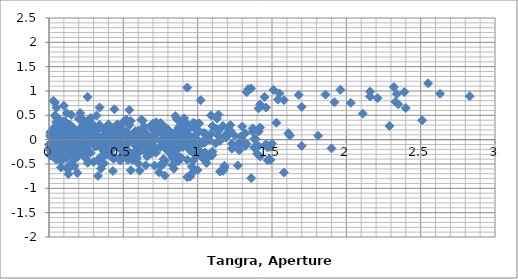
| Category | Series 0 |
|---|---|
| 0.1999999999999993 | -0.051 |
| 0.27999999999999936 | -0.267 |
| 0.3199999999999985 | 0.495 |
| 0.4299999999999997 | 0.243 |
| 0.4399999999999995 | -0.087 |
| 0.47999999999999865 | 0.167 |
| 0.48999999999999844 | -0.048 |
| 0.5 | 0.112 |
| 0.5099999999999998 | -0.189 |
| 0.5399999999999991 | 0.611 |
| 0.6199999999999992 | 0.04 |
| 0.6699999999999999 | 0.006 |
| 0.6699999999999999 | -0.096 |
| 0.7199999999999989 | 0.358 |
| 0.7999999999999989 | 0.136 |
| 0.8699999999999992 | -0.134 |
| 0.9099999999999984 | 0.124 |
| 0.9699999999999989 | -0.033 |
| 1.129999999999999 | 0.218 |
| 1.1499999999999986 | -0.027 |
| 1.25 | 0.08 |
| 1.2799999999999994 | -0.059 |
| 1.2899999999999991 | 0.068 |
| 1.3199999999999985 | -0.129 |
| 1.3699999999999992 | 0.233 |
| 1.379999999999999 | 0.014 |
| 1.4099999999999984 | 0.166 |
| 1.42 | 0.249 |
| 1.4699999999999989 | -0.159 |
| 1.4899999999999984 | -0.147 |
| 1.5 | -0.084 |
| 1.8099999999999987 | 0.082 |
| 1.8999999999999986 | -0.179 |
| 2.83 | 0.892 |
| 0.08000000000000007 | -0.216 |
| 0.11999999999999922 | 0.546 |
| 0.23000000000000043 | 0.294 |
| 0.2400000000000002 | -0.036 |
| 0.27999999999999936 | 0.218 |
| 0.28999999999999915 | 0.003 |
| 0.3000000000000007 | 0.163 |
| 0.3100000000000005 | -0.138 |
| 0.33999999999999986 | 0.661 |
| 0.41999999999999993 | 0.091 |
| 0.47000000000000064 | 0.057 |
| 0.47000000000000064 | -0.045 |
| 0.5199999999999996 | 0.408 |
| 0.5999999999999996 | 0.187 |
| 0.6699999999999999 | -0.083 |
| 0.7099999999999991 | 0.175 |
| 0.7699999999999996 | 0.017 |
| 0.9299999999999997 | 0.269 |
| 0.9499999999999993 | 0.024 |
| 1.0500000000000007 | 0.13 |
| 1.08 | -0.008 |
| 1.0899999999999999 | 0.119 |
| 1.1199999999999992 | -0.079 |
| 1.17 | 0.284 |
| 1.1799999999999997 | 0.065 |
| 1.209999999999999 | 0.216 |
| 1.2200000000000006 | 0.3 |
| 1.2699999999999996 | -0.109 |
| 1.2899999999999991 | -0.096 |
| 1.3000000000000007 | -0.033 |
| 1.6099999999999994 | 0.132 |
| 1.6999999999999993 | -0.128 |
| 2.630000000000001 | 0.943 |
| 0.03999999999999915 | 0.762 |
| 0.15000000000000036 | 0.51 |
| 0.16000000000000014 | 0.18 |
| 0.1999999999999993 | 0.434 |
| 0.20999999999999908 | 0.218 |
| 0.22000000000000064 | 0.379 |
| 0.23000000000000043 | 0.078 |
| 0.2599999999999998 | 0.877 |
| 0.33999999999999986 | 0.307 |
| 0.39000000000000057 | 0.273 |
| 0.39000000000000057 | 0.17 |
| 0.4399999999999995 | 0.624 |
| 0.5199999999999996 | 0.403 |
| 0.5899999999999999 | 0.132 |
| 0.629999999999999 | 0.39 |
| 0.6899999999999995 | 0.233 |
| 0.8499999999999996 | 0.485 |
| 0.8699999999999992 | 0.24 |
| 0.9700000000000006 | 0.346 |
| 1.0 | 0.208 |
| 1.0099999999999998 | 0.335 |
| 1.0399999999999991 | 0.137 |
| 1.0899999999999999 | 0.499 |
| 1.0999999999999996 | 0.281 |
| 1.129999999999999 | 0.432 |
| 1.1400000000000006 | 0.516 |
| 1.1899999999999995 | 0.107 |
| 1.209999999999999 | 0.12 |
| 1.2200000000000006 | 0.183 |
| 1.5299999999999994 | 0.348 |
| 1.6199999999999992 | 0.087 |
| 2.5500000000000007 | 1.159 |
| 0.11000000000000121 | -0.252 |
| 0.120000000000001 | -0.582 |
| 0.16000000000000014 | -0.328 |
| 0.16999999999999993 | -0.543 |
| 0.1800000000000015 | -0.383 |
| 0.19000000000000128 | -0.684 |
| 0.22000000000000064 | 0.116 |
| 0.3000000000000007 | -0.455 |
| 0.3500000000000014 | -0.489 |
| 0.3500000000000014 | -0.591 |
| 0.40000000000000036 | -0.137 |
| 0.4800000000000004 | -0.359 |
| 0.5500000000000007 | -0.629 |
| 0.5899999999999999 | -0.371 |
| 0.6500000000000004 | -0.528 |
| 0.8100000000000005 | -0.277 |
| 0.8300000000000001 | -0.522 |
| 0.9300000000000015 | -0.415 |
| 0.9600000000000009 | -0.554 |
| 0.9700000000000006 | -0.427 |
| 1.0 | -0.624 |
| 1.0500000000000007 | -0.262 |
| 1.0600000000000005 | -0.481 |
| 1.0899999999999999 | -0.329 |
| 1.1000000000000014 | -0.246 |
| 1.1500000000000004 | -0.654 |
| 1.17 | -0.642 |
| 1.1800000000000015 | -0.579 |
| 1.4900000000000002 | -0.413 |
| 1.58 | -0.674 |
| 2.5100000000000016 | 0.397 |
| 0.009999999999999787 | -0.33 |
| 0.049999999999998934 | -0.076 |
| 0.05999999999999872 | -0.291 |
| 0.07000000000000028 | -0.131 |
| 0.08000000000000007 | -0.432 |
| 0.10999999999999943 | 0.368 |
| 0.1899999999999995 | -0.203 |
| 0.2400000000000002 | -0.237 |
| 0.2400000000000002 | -0.339 |
| 0.28999999999999915 | 0.115 |
| 0.3699999999999992 | -0.107 |
| 0.4399999999999995 | -0.377 |
| 0.47999999999999865 | -0.119 |
| 0.5399999999999991 | -0.276 |
| 0.6999999999999993 | -0.025 |
| 0.7199999999999989 | -0.27 |
| 0.8200000000000003 | -0.163 |
| 0.8499999999999996 | -0.302 |
| 0.8599999999999994 | -0.175 |
| 0.8899999999999988 | -0.372 |
| 0.9399999999999995 | -0.01 |
| 0.9499999999999993 | -0.229 |
| 0.9799999999999986 | -0.077 |
| 0.9900000000000002 | 0.006 |
| 1.0399999999999991 | -0.402 |
| 1.0599999999999987 | -0.39 |
| 1.0700000000000003 | -0.327 |
| 1.379999999999999 | -0.161 |
| 1.4699999999999989 | -0.422 |
| 2.4000000000000004 | 0.649 |
| 0.03999999999999915 | 0.254 |
| 0.049999999999998934 | 0.039 |
| 0.0600000000000005 | 0.199 |
| 0.07000000000000028 | -0.102 |
| 0.09999999999999964 | 0.697 |
| 0.17999999999999972 | 0.127 |
| 0.23000000000000043 | 0.093 |
| 0.23000000000000043 | -0.009 |
| 0.27999999999999936 | 0.444 |
| 0.35999999999999943 | 0.223 |
| 0.4299999999999997 | -0.047 |
| 0.46999999999999886 | 0.211 |
| 0.5299999999999994 | 0.053 |
| 0.6899999999999995 | 0.305 |
| 0.7099999999999991 | 0.06 |
| 0.8100000000000005 | 0.166 |
| 0.8399999999999999 | 0.028 |
| 0.8499999999999996 | 0.155 |
| 0.879999999999999 | -0.043 |
| 0.9299999999999997 | 0.32 |
| 0.9399999999999995 | 0.101 |
| 0.9699999999999989 | 0.252 |
| 0.9800000000000004 | 0.336 |
| 1.0299999999999994 | -0.073 |
| 1.049999999999999 | -0.06 |
| 1.0600000000000005 | 0.003 |
| 1.3699999999999992 | 0.168 |
| 1.459999999999999 | -0.092 |
| 2.3900000000000006 | 0.979 |
| 0.009999999999999787 | -0.215 |
| 0.02000000000000135 | -0.055 |
| 0.030000000000001137 | -0.356 |
| 0.0600000000000005 | 0.444 |
| 0.14000000000000057 | -0.127 |
| 0.19000000000000128 | -0.161 |
| 0.19000000000000128 | -0.263 |
| 0.2400000000000002 | 0.191 |
| 0.3200000000000003 | -0.031 |
| 0.39000000000000057 | -0.301 |
| 0.4299999999999997 | -0.043 |
| 0.4900000000000002 | -0.2 |
| 0.6500000000000004 | 0.051 |
| 0.6699999999999999 | -0.194 |
| 0.7700000000000014 | -0.087 |
| 0.8000000000000007 | -0.226 |
| 0.8100000000000005 | -0.099 |
| 0.8399999999999999 | -0.296 |
| 0.8900000000000006 | 0.066 |
| 0.9000000000000004 | -0.153 |
| 0.9299999999999997 | -0.001 |
| 0.9400000000000013 | 0.082 |
| 0.9900000000000002 | -0.326 |
| 1.0099999999999998 | -0.314 |
| 1.0200000000000014 | -0.251 |
| 1.33 | -0.085 |
| 1.42 | -0.346 |
| 2.3500000000000014 | 0.725 |
| 0.010000000000001563 | 0.16 |
| 0.02000000000000135 | -0.141 |
| 0.05000000000000071 | 0.659 |
| 0.13000000000000078 | 0.088 |
| 0.1800000000000015 | 0.054 |
| 0.1800000000000015 | -0.048 |
| 0.23000000000000043 | 0.406 |
| 0.3100000000000005 | 0.184 |
| 0.3800000000000008 | -0.086 |
| 0.41999999999999993 | 0.172 |
| 0.4800000000000004 | 0.015 |
| 0.6400000000000006 | 0.266 |
| 0.6600000000000001 | 0.021 |
| 0.7600000000000016 | 0.128 |
| 0.7900000000000009 | -0.011 |
| 0.8000000000000007 | 0.117 |
| 0.8300000000000001 | -0.081 |
| 0.8800000000000008 | 0.281 |
| 0.8900000000000006 | 0.062 |
| 0.9199999999999999 | 0.214 |
| 0.9300000000000015 | 0.297 |
| 0.9800000000000004 | -0.111 |
| 1.0 | -0.099 |
| 1.0100000000000016 | -0.036 |
| 1.3200000000000003 | 0.13 |
| 1.4100000000000001 | -0.131 |
| 2.3400000000000016 | 0.94 |
| 0.009999999999999787 | -0.301 |
| 0.03999999999999915 | 0.498 |
| 0.11999999999999922 | -0.072 |
| 0.16999999999999993 | -0.106 |
| 0.16999999999999993 | -0.208 |
| 0.21999999999999886 | 0.246 |
| 0.29999999999999893 | 0.024 |
| 0.3699999999999992 | -0.246 |
| 0.40999999999999837 | 0.012 |
| 0.46999999999999886 | -0.146 |
| 0.629999999999999 | 0.106 |
| 0.6499999999999986 | -0.139 |
| 0.75 | -0.032 |
| 0.7799999999999994 | -0.171 |
| 0.7899999999999991 | -0.044 |
| 0.8199999999999985 | -0.242 |
| 0.8699999999999992 | 0.121 |
| 0.879999999999999 | -0.098 |
| 0.9099999999999984 | 0.053 |
| 0.9199999999999999 | 0.137 |
| 0.9699999999999989 | -0.272 |
| 0.9899999999999984 | -0.259 |
| 1.0 | -0.196 |
| 1.3099999999999987 | -0.031 |
| 1.3999999999999986 | -0.291 |
| 2.33 | 0.78 |
| 0.02999999999999936 | 0.8 |
| 0.10999999999999943 | 0.229 |
| 0.16000000000000014 | 0.195 |
| 0.16000000000000014 | 0.093 |
| 0.20999999999999908 | 0.547 |
| 0.28999999999999915 | 0.325 |
| 0.35999999999999943 | 0.055 |
| 0.3999999999999986 | 0.313 |
| 0.4599999999999991 | 0.156 |
| 0.6199999999999992 | 0.407 |
| 0.6399999999999988 | 0.162 |
| 0.7400000000000002 | 0.269 |
| 0.7699999999999996 | 0.13 |
| 0.7799999999999994 | 0.257 |
| 0.8099999999999987 | 0.06 |
| 0.8599999999999994 | 0.422 |
| 0.8699999999999992 | 0.203 |
| 0.8999999999999986 | 0.355 |
| 0.9100000000000001 | 0.438 |
| 0.9599999999999991 | 0.03 |
| 0.9799999999999986 | 0.042 |
| 0.9900000000000002 | 0.105 |
| 1.299999999999999 | 0.271 |
| 1.3899999999999988 | 0.01 |
| 2.3200000000000003 | 1.081 |
| 0.08000000000000007 | -0.57 |
| 0.13000000000000078 | -0.604 |
| 0.13000000000000078 | -0.707 |
| 0.17999999999999972 | -0.253 |
| 0.2599999999999998 | -0.475 |
| 0.33000000000000007 | -0.745 |
| 0.3699999999999992 | -0.487 |
| 0.4299999999999997 | -0.644 |
| 0.5899999999999999 | -0.392 |
| 0.6099999999999994 | -0.637 |
| 0.7100000000000009 | -0.531 |
| 0.7400000000000002 | -0.67 |
| 0.75 | -0.542 |
| 0.7799999999999994 | -0.74 |
| 0.8300000000000001 | -0.378 |
| 0.8399999999999999 | -0.596 |
| 0.8699999999999992 | -0.445 |
| 0.8800000000000008 | -0.361 |
| 0.9299999999999997 | -0.77 |
| 0.9499999999999993 | -0.757 |
| 0.9600000000000009 | -0.694 |
| 1.2699999999999996 | -0.529 |
| 1.3599999999999994 | -0.79 |
| 2.290000000000001 | 0.282 |
| 0.05000000000000071 | -0.034 |
| 0.05000000000000071 | -0.136 |
| 0.09999999999999964 | 0.318 |
| 0.17999999999999972 | 0.096 |
| 0.25 | -0.174 |
| 0.28999999999999915 | 0.084 |
| 0.34999999999999964 | -0.074 |
| 0.5099999999999998 | 0.178 |
| 0.5299999999999994 | -0.067 |
| 0.6300000000000008 | 0.04 |
| 0.6600000000000001 | -0.099 |
| 0.6699999999999999 | 0.028 |
| 0.6999999999999993 | -0.17 |
| 0.75 | 0.193 |
| 0.7599999999999998 | -0.026 |
| 0.7899999999999991 | 0.125 |
| 0.8000000000000007 | 0.209 |
| 0.8499999999999996 | -0.2 |
| 0.8699999999999992 | -0.187 |
| 0.8800000000000008 | -0.124 |
| 1.1899999999999995 | 0.041 |
| 1.2799999999999994 | -0.219 |
| 2.210000000000001 | 0.852 |
| 0.0 | -0.102 |
| 0.049999999999998934 | 0.352 |
| 0.129999999999999 | 0.13 |
| 0.1999999999999993 | -0.14 |
| 0.23999999999999844 | 0.118 |
| 0.29999999999999893 | -0.04 |
| 0.4599999999999991 | 0.212 |
| 0.47999999999999865 | -0.033 |
| 0.5800000000000001 | 0.074 |
| 0.6099999999999994 | -0.065 |
| 0.6199999999999992 | 0.062 |
| 0.6499999999999986 | -0.136 |
| 0.6999999999999993 | 0.227 |
| 0.7099999999999991 | 0.008 |
| 0.7399999999999984 | 0.159 |
| 0.75 | 0.243 |
| 0.7999999999999989 | -0.166 |
| 0.8199999999999985 | -0.153 |
| 0.8300000000000001 | -0.09 |
| 1.1399999999999988 | 0.075 |
| 1.2299999999999986 | -0.185 |
| 2.16 | 0.886 |
| 0.049999999999998934 | 0.454 |
| 0.129999999999999 | 0.232 |
| 0.1999999999999993 | -0.038 |
| 0.23999999999999844 | 0.22 |
| 0.29999999999999893 | 0.063 |
| 0.4599999999999991 | 0.314 |
| 0.47999999999999865 | 0.069 |
| 0.5800000000000001 | 0.176 |
| 0.6099999999999994 | 0.037 |
| 0.6199999999999992 | 0.164 |
| 0.6499999999999986 | -0.033 |
| 0.6999999999999993 | 0.329 |
| 0.7099999999999991 | 0.11 |
| 0.7399999999999984 | 0.262 |
| 0.75 | 0.345 |
| 0.7999999999999989 | -0.063 |
| 0.8199999999999985 | -0.051 |
| 0.8300000000000001 | 0.012 |
| 1.1399999999999988 | 0.178 |
| 1.2299999999999986 | -0.083 |
| 2.16 | 0.988 |
| 0.08000000000000007 | -0.222 |
| 0.15000000000000036 | -0.492 |
| 0.1899999999999995 | -0.234 |
| 0.25 | -0.391 |
| 0.41000000000000014 | -0.139 |
| 0.4299999999999997 | -0.384 |
| 0.5300000000000011 | -0.278 |
| 0.5600000000000005 | -0.417 |
| 0.5700000000000003 | -0.289 |
| 0.5999999999999996 | -0.487 |
| 0.6500000000000004 | -0.125 |
| 0.6600000000000001 | -0.343 |
| 0.6899999999999995 | -0.192 |
| 0.7000000000000011 | -0.108 |
| 0.75 | -0.517 |
| 0.7699999999999996 | -0.505 |
| 0.7800000000000011 | -0.441 |
| 1.0899999999999999 | -0.276 |
| 1.1799999999999997 | -0.537 |
| 2.110000000000001 | 0.535 |
| 0.07000000000000028 | -0.27 |
| 0.10999999999999943 | -0.012 |
| 0.16999999999999993 | -0.169 |
| 0.33000000000000007 | 0.082 |
| 0.34999999999999964 | -0.163 |
| 0.45000000000000107 | -0.056 |
| 0.4800000000000004 | -0.195 |
| 0.4900000000000002 | -0.068 |
| 0.5199999999999996 | -0.265 |
| 0.5700000000000003 | 0.097 |
| 0.5800000000000001 | -0.122 |
| 0.6099999999999994 | 0.03 |
| 0.620000000000001 | 0.113 |
| 0.6699999999999999 | -0.295 |
| 0.6899999999999995 | -0.283 |
| 0.7000000000000011 | -0.22 |
| 1.0099999999999998 | -0.054 |
| 1.0999999999999996 | -0.315 |
| 2.030000000000001 | 0.756 |
| 0.03999999999999915 | 0.258 |
| 0.09999999999999964 | 0.101 |
| 0.2599999999999998 | 0.352 |
| 0.27999999999999936 | 0.107 |
| 0.3800000000000008 | 0.214 |
| 0.41000000000000014 | 0.075 |
| 0.41999999999999993 | 0.203 |
| 0.4499999999999993 | 0.005 |
| 0.5 | 0.367 |
| 0.5099999999999998 | 0.149 |
| 0.5399999999999991 | 0.3 |
| 0.5500000000000007 | 0.383 |
| 0.5999999999999996 | -0.025 |
| 0.6199999999999992 | -0.013 |
| 0.6300000000000008 | 0.05 |
| 0.9399999999999995 | 0.216 |
| 1.0299999999999994 | -0.045 |
| 1.9600000000000009 | 1.026 |
| 0.0600000000000005 | -0.157 |
| 0.22000000000000064 | 0.094 |
| 0.2400000000000002 | -0.151 |
| 0.34000000000000163 | -0.044 |
| 0.370000000000001 | -0.183 |
| 0.3800000000000008 | -0.055 |
| 0.41000000000000014 | -0.253 |
| 0.46000000000000085 | 0.109 |
| 0.47000000000000064 | -0.109 |
| 0.5 | 0.042 |
| 0.5100000000000016 | 0.126 |
| 0.5600000000000005 | -0.283 |
| 0.5800000000000001 | -0.271 |
| 0.5900000000000016 | -0.208 |
| 0.9000000000000004 | -0.042 |
| 0.9900000000000002 | -0.303 |
| 1.9200000000000017 | 0.769 |
| 0.16000000000000014 | 0.252 |
| 0.17999999999999972 | 0.007 |
| 0.28000000000000114 | 0.113 |
| 0.3100000000000005 | -0.026 |
| 0.3200000000000003 | 0.102 |
| 0.34999999999999964 | -0.096 |
| 0.40000000000000036 | 0.266 |
| 0.41000000000000014 | 0.048 |
| 0.4399999999999995 | 0.199 |
| 0.45000000000000107 | 0.283 |
| 0.5 | -0.126 |
| 0.5199999999999996 | -0.113 |
| 0.5300000000000011 | -0.05 |
| 0.8399999999999999 | 0.115 |
| 0.9299999999999997 | -0.146 |
| 1.8600000000000012 | 0.926 |
| 0.019999999999999574 | -0.245 |
| 0.120000000000001 | -0.139 |
| 0.15000000000000036 | -0.277 |
| 0.16000000000000014 | -0.15 |
| 0.1899999999999995 | -0.348 |
| 0.2400000000000002 | 0.015 |
| 0.25 | -0.204 |
| 0.27999999999999936 | -0.053 |
| 0.2900000000000009 | 0.031 |
| 0.33999999999999986 | -0.378 |
| 0.35999999999999943 | -0.365 |
| 0.370000000000001 | -0.302 |
| 0.6799999999999997 | -0.137 |
| 0.7699999999999996 | -0.397 |
| 1.700000000000001 | 0.674 |
| 0.10000000000000142 | 0.106 |
| 0.13000000000000078 | -0.032 |
| 0.14000000000000057 | 0.095 |
| 0.16999999999999993 | -0.103 |
| 0.22000000000000064 | 0.26 |
| 0.23000000000000043 | 0.041 |
| 0.2599999999999998 | 0.192 |
| 0.27000000000000135 | 0.276 |
| 0.3200000000000003 | -0.133 |
| 0.33999999999999986 | -0.12 |
| 0.3500000000000014 | -0.057 |
| 0.6600000000000001 | 0.108 |
| 0.75 | -0.152 |
| 1.6800000000000015 | 0.919 |
| 0.02999999999999936 | -0.139 |
| 0.03999999999999915 | -0.011 |
| 0.06999999999999851 | -0.209 |
| 0.11999999999999922 | 0.153 |
| 0.129999999999999 | -0.065 |
| 0.15999999999999837 | 0.086 |
| 0.16999999999999993 | 0.17 |
| 0.21999999999999886 | -0.239 |
| 0.23999999999999844 | -0.227 |
| 0.25 | -0.163 |
| 0.5599999999999987 | 0.002 |
| 0.6499999999999986 | -0.259 |
| 1.58 | 0.813 |
| 0.009999999999999787 | 0.127 |
| 0.03999999999999915 | -0.071 |
| 0.08999999999999986 | 0.292 |
| 0.09999999999999964 | 0.073 |
| 0.129999999999999 | 0.225 |
| 0.14000000000000057 | 0.308 |
| 0.1899999999999995 | -0.1 |
| 0.20999999999999908 | -0.088 |
| 0.22000000000000064 | -0.025 |
| 0.5299999999999994 | 0.141 |
| 0.6199999999999992 | -0.12 |
| 1.5500000000000007 | 0.951 |
| 0.02999999999999936 | -0.198 |
| 0.08000000000000007 | 0.164 |
| 0.08999999999999986 | -0.054 |
| 0.11999999999999922 | 0.097 |
| 0.13000000000000078 | 0.181 |
| 0.17999999999999972 | -0.228 |
| 0.1999999999999993 | -0.215 |
| 0.21000000000000085 | -0.152 |
| 0.5199999999999996 | 0.013 |
| 0.6099999999999994 | -0.248 |
| 1.540000000000001 | 0.824 |
| 0.05000000000000071 | 0.362 |
| 0.0600000000000005 | 0.144 |
| 0.08999999999999986 | 0.295 |
| 0.10000000000000142 | 0.379 |
| 0.15000000000000036 | -0.03 |
| 0.16999999999999993 | -0.017 |
| 0.1800000000000015 | 0.046 |
| 0.4900000000000002 | 0.211 |
| 0.5800000000000001 | -0.05 |
| 1.5100000000000016 | 1.022 |
| 0.009999999999999787 | -0.219 |
| 0.03999999999999915 | -0.067 |
| 0.05000000000000071 | 0.016 |
| 0.09999999999999964 | -0.392 |
| 0.11999999999999922 | -0.38 |
| 0.13000000000000078 | -0.317 |
| 0.4399999999999995 | -0.151 |
| 0.5299999999999994 | -0.412 |
| 1.4600000000000009 | 0.659 |
| 0.02999999999999936 | 0.151 |
| 0.040000000000000924 | 0.235 |
| 0.08999999999999986 | -0.174 |
| 0.10999999999999943 | -0.161 |
| 0.120000000000001 | -0.098 |
| 0.4299999999999997 | 0.067 |
| 0.5199999999999996 | -0.194 |
| 1.450000000000001 | 0.878 |
| 0.010000000000001563 | 0.084 |
| 0.0600000000000005 | -0.325 |
| 0.08000000000000007 | -0.313 |
| 0.09000000000000163 | -0.249 |
| 0.40000000000000036 | -0.084 |
| 0.4900000000000002 | -0.345 |
| 1.4200000000000017 | 0.727 |
| 0.049999999999998934 | -0.409 |
| 0.06999999999999851 | -0.396 |
| 0.08000000000000007 | -0.333 |
| 0.3899999999999988 | -0.168 |
| 0.47999999999999865 | -0.429 |
| 1.4100000000000001 | 0.643 |
| 0.019999999999999574 | 0.013 |
| 0.030000000000001137 | 0.076 |
| 0.33999999999999986 | 0.241 |
| 0.4299999999999997 | -0.02 |
| 1.3600000000000012 | 1.052 |
| 0.010000000000001563 | 0.063 |
| 0.3200000000000003 | 0.228 |
| 0.41000000000000014 | -0.032 |
| 1.3400000000000016 | 1.039 |
| 0.3099999999999987 | 0.165 |
| 0.3999999999999986 | -0.095 |
| 1.33 | 0.976 |
| 0.08999999999999986 | -0.261 |
| 1.0200000000000014 | 0.811 |
| 0.9300000000000015 | 1.072 |